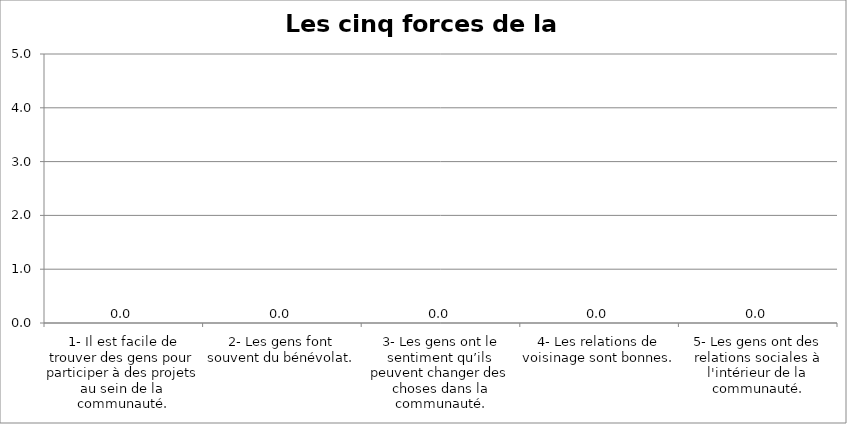
| Category | Moyenne |
|---|---|
| 1- Il est facile de trouver des gens pour participer à des projets au sein de la communauté. | 0 |
| 2- Les gens font souvent du bénévolat. | 0 |
| 3- Les gens ont le sentiment qu’ils peuvent changer des choses dans la communauté. | 0 |
| 4- Les relations de voisinage sont bonnes. | 0 |
| 5- Les gens ont des relations sociales à l'intérieur de la communauté. | 0 |